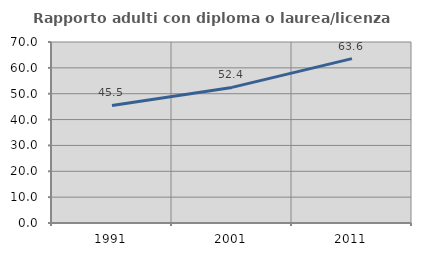
| Category | Rapporto adulti con diploma o laurea/licenza media  |
|---|---|
| 1991.0 | 45.455 |
| 2001.0 | 52.442 |
| 2011.0 | 63.584 |